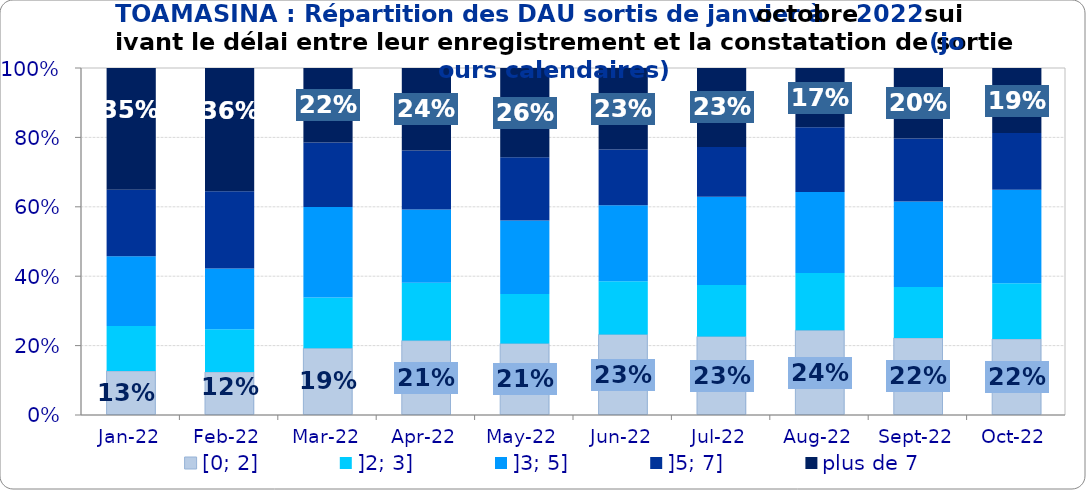
| Category | [0; 2] | ]2; 3] | ]3; 5] | ]5; 7] | plus de 7 |
|---|---|---|---|---|---|
| 2022-01-01 | 0.127 | 0.13 | 0.201 | 0.192 | 0.351 |
| 2022-02-01 | 0.124 | 0.123 | 0.175 | 0.222 | 0.356 |
| 2022-03-01 | 0.192 | 0.146 | 0.261 | 0.186 | 0.215 |
| 2022-04-01 | 0.214 | 0.166 | 0.211 | 0.17 | 0.237 |
| 2022-05-01 | 0.206 | 0.143 | 0.212 | 0.182 | 0.257 |
| 2022-06-01 | 0.232 | 0.153 | 0.219 | 0.16 | 0.235 |
| 2022-07-01 | 0.226 | 0.148 | 0.254 | 0.144 | 0.228 |
| 2022-08-01 | 0.244 | 0.165 | 0.233 | 0.186 | 0.171 |
| 2022-09-01 | 0.222 | 0.146 | 0.247 | 0.181 | 0.203 |
| 2022-10-01 | 0.219 | 0.161 | 0.269 | 0.163 | 0.188 |